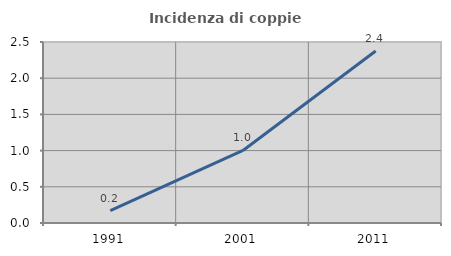
| Category | Incidenza di coppie miste |
|---|---|
| 1991.0 | 0.17 |
| 2001.0 | 1.002 |
| 2011.0 | 2.377 |